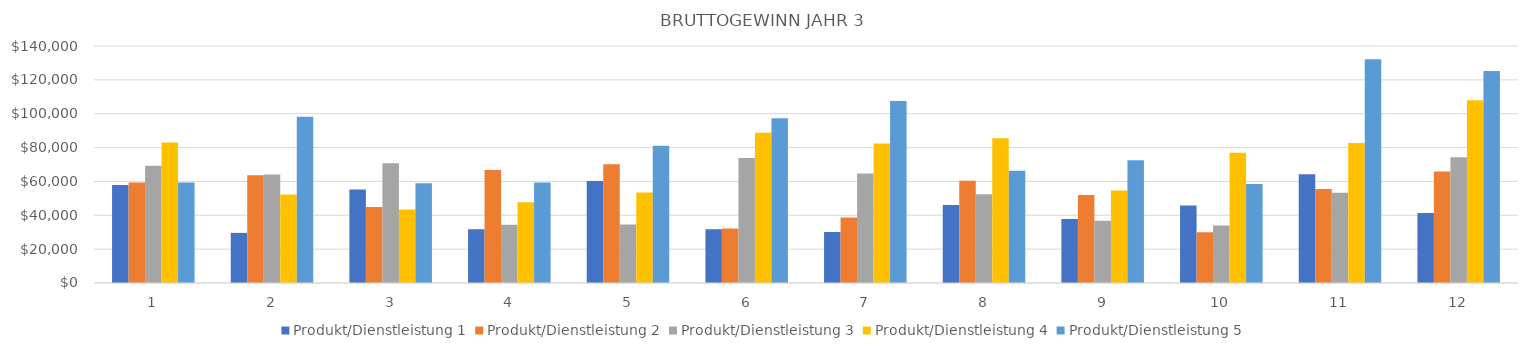
| Category | Produkt/Dienstleistung 1 | Produkt/Dienstleistung 2 | Produkt/Dienstleistung 3 | Produkt/Dienstleistung 4 | Produkt/Dienstleistung 5 |
|---|---|---|---|---|---|
| 0 | 57836.6 | 59440 | 69246 | 82984 | 59413.5 |
| 1 | 29614.1 | 63648 | 64143 | 52347.6 | 98185.5 |
| 2 | 55166.4 | 44895 | 70812 | 43367.7 | 58932.5 |
| 3 | 31708.8 | 66690.6 | 34479 | 47752.2 | 59427.5 |
| 4 | 60206.4 | 70077.2 | 34560 | 53457.6 | 81075 |
| 5 | 31779.6 | 32250.6 | 73809 | 88777.8 | 97290 |
| 6 | 30153.7 | 38663 | 64629 | 82350.9 | 107459.5 |
| 7 | 46071.9 | 60368.4 | 52452 | 85547.7 | 66308.5 |
| 8 | 37793.3 | 52053.6 | 36738 | 54600.9 | 72485.5 |
| 9 | 45727.2 | 29979.2 | 33957 | 76889.7 | 58522 |
| 10 | 64291.5 | 55457.4 | 53364 | 82752.7 | 132151.5 |
| 11 | 41314 | 65830.8 | 74340 | 108009.5 | 125209.5 |